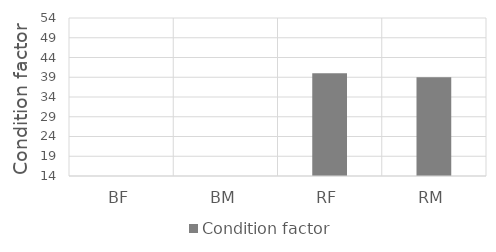
| Category | Condition factor |
|---|---|
| BF | 0 |
| BM | 0 |
| RF | 40 |
| RM | 39 |